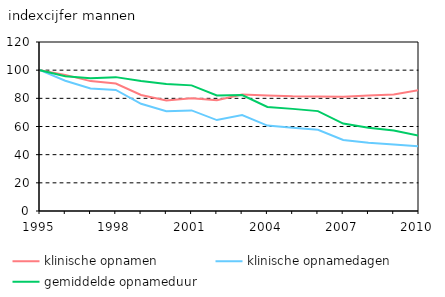
| Category | klinische opnamen | klinische opnamedagen | gemiddelde opnameduur |
|---|---|---|---|
| 1995.0 | 100 | 100 | 100 |
| 1996.0 | 96.641 | 92.502 | 95.717 |
| 1997.0 | 92.223 | 86.929 | 94.26 |
| 1998.0 | 90.459 | 85.984 | 95.053 |
| 1999.0 | 82.414 | 76.124 | 92.367 |
| 2000.0 | 78.509 | 70.828 | 90.217 |
| 2001.0 | 80.089 | 71.44 | 89.201 |
| 2002.0 | 78.681 | 64.566 | 82.061 |
| 2003.0 | 82.757 | 68.145 | 82.343 |
| 2004.0 | 82.099 | 60.661 | 73.888 |
| 2005.0 | 81.473 | 59.08 | 72.515 |
| 2006.0 | 81.372 | 57.711 | 70.923 |
| 2007.0 | 81.137 | 50.391 | 62.106 |
| 2008.0 | 82.026 | 48.505 | 59.133 |
| 2009.0 | 82.672 | 47.269 | 57.176 |
| 2010.0 | 85.855 | 45.868 | 53.425 |